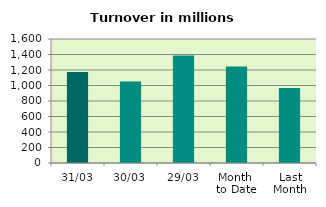
| Category | Series 0 |
|---|---|
| 31/03 | 1173.639 |
| 30/03 | 1051.736 |
| 29/03 | 1385.677 |
| Month 
to Date | 1246.474 |
| Last
Month | 966.674 |